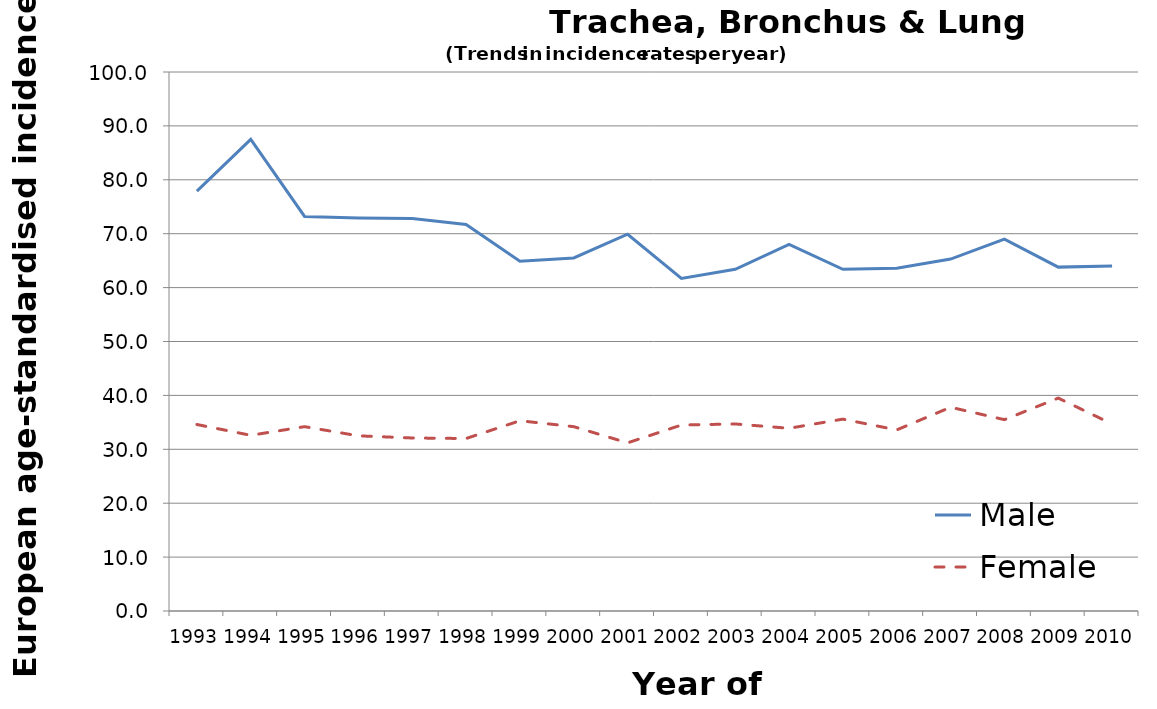
| Category | Male | Female |
|---|---|---|
| 1993.0 | 77.9 | 34.6 |
| 1994.0 | 87.5 | 32.6 |
| 1995.0 | 73.2 | 34.2 |
| 1996.0 | 72.9 | 32.5 |
| 1997.0 | 72.8 | 32.1 |
| 1998.0 | 71.7 | 32 |
| 1999.0 | 64.9 | 35.3 |
| 2000.0 | 65.5 | 34.2 |
| 2001.0 | 69.9 | 31.2 |
| 2002.0 | 61.7 | 34.5 |
| 2003.0 | 63.4 | 34.7 |
| 2004.0 | 68 | 33.9 |
| 2005.0 | 63.4 | 35.6 |
| 2006.0 | 63.6 | 33.6 |
| 2007.0 | 65.3 | 37.8 |
| 2008.0 | 69 | 35.5 |
| 2009.0 | 63.8 | 39.5 |
| 2010.0 | 64 | 34.7 |